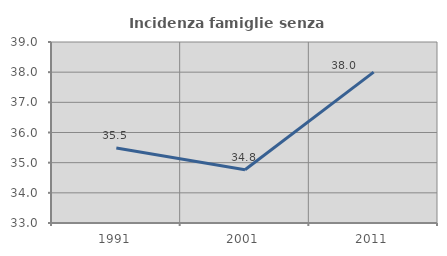
| Category | Incidenza famiglie senza nuclei |
|---|---|
| 1991.0 | 35.484 |
| 2001.0 | 34.763 |
| 2011.0 | 38.002 |